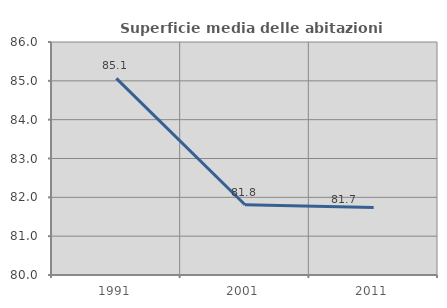
| Category | Superficie media delle abitazioni occupate |
|---|---|
| 1991.0 | 85.062 |
| 2001.0 | 81.809 |
| 2011.0 | 81.737 |